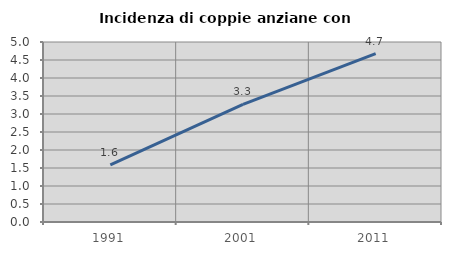
| Category | Incidenza di coppie anziane con figli |
|---|---|
| 1991.0 | 1.585 |
| 2001.0 | 3.268 |
| 2011.0 | 4.679 |